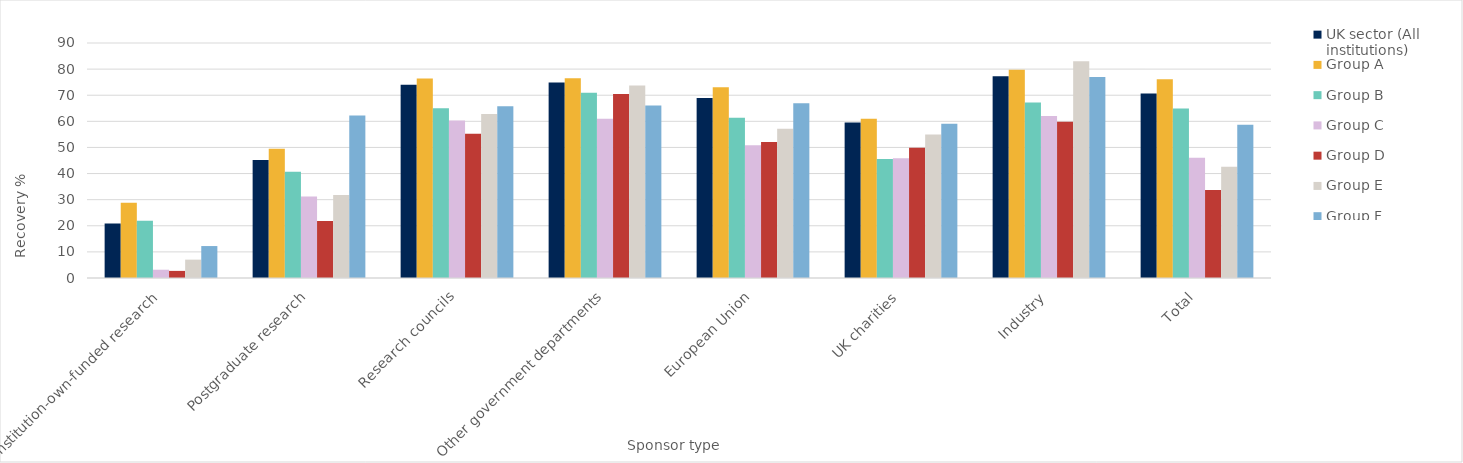
| Category | UK sector (All institutions) | Group A | Group B | Group C | Group D | Group E | Group F |
|---|---|---|---|---|---|---|---|
| 0 | 20.918 | 28.797 | 21.937 | 3.171 | 2.723 | 7.031 | 12.235 |
| 1 | 45.218 | 49.459 | 40.648 | 31.208 | 21.857 | 31.764 | 62.221 |
| 2 | 74.049 | 76.365 | 64.966 | 60.274 | 55.278 | 62.853 | 65.734 |
| 3 | 74.899 | 76.483 | 70.937 | 61.021 | 70.456 | 73.764 | 66.055 |
| 4 | 68.899 | 73.089 | 61.393 | 50.873 | 52.047 | 57.199 | 66.942 |
| 5 | 59.541 | 60.946 | 45.62 | 45.833 | 49.874 | 54.974 | 59.082 |
| 6 | 77.229 | 79.77 | 67.255 | 62.024 | 59.874 | 82.967 | 77.018 |
| 7 | 70.649 | 76.088 | 64.885 | 46.094 | 33.747 | 42.598 | 58.661 |